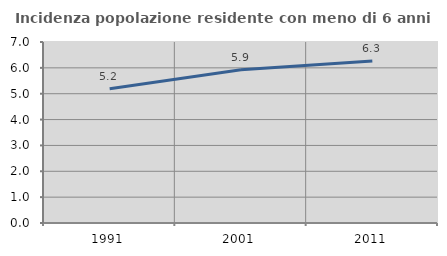
| Category | Incidenza popolazione residente con meno di 6 anni |
|---|---|
| 1991.0 | 5.195 |
| 2001.0 | 5.925 |
| 2011.0 | 6.267 |